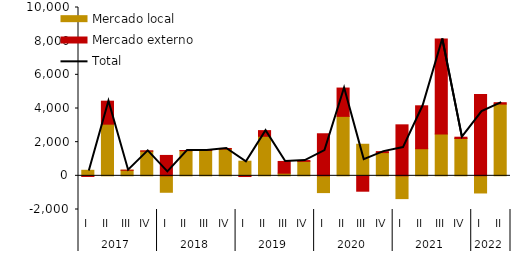
| Category | Mercado local | Mercado externo |
|---|---|---|
| 0 | 329.322 | -37.381 |
| 1 | 3069.072 | 1365.311 |
| 2 | 332.399 | 3.42 |
| 3 | 1461.777 | 23.177 |
| 4 | -976.66 | 1212.291 |
| 5 | 1493.889 | 10.784 |
| 6 | 1508.649 | 1.208 |
| 7 | 1593.172 | 32.676 |
| 8 | 869.628 | -41.555 |
| 9 | 2349.095 | 337.07 |
| 10 | 157.361 | 696.514 |
| 11 | 859.211 | 47.718 |
| 12 | -996.075 | 2499.325 |
| 13 | 3532.448 | 1682.361 |
| 14 | 1875.404 | -913.097 |
| 15 | 1379.819 | 58.735 |
| 16 | -1352.931 | 3029.899 |
| 17 | 1611.156 | 2549.671 |
| 18 | 2483.947 | 5648.601 |
| 19 | 2217.35 | 77.574 |
| 20 | -1018.088 | 4832.956 |
| 21 | 4261.021 | 83.806 |